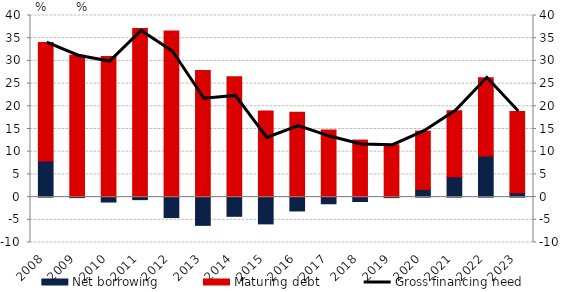
| Category | Net borrowing | Maturing debt |
|---|---|---|
| 2008.0 | 7.937 | 26.102 |
| 2009.0 | -0.115 | 31.264 |
| 2010.0 | -1.088 | 30.946 |
| 2011.0 | -0.558 | 37.14 |
| 2012.0 | -4.505 | 36.569 |
| 2013.0 | -6.224 | 27.885 |
| 2014.0 | -4.231 | 26.516 |
| 2015.0 | -5.901 | 18.943 |
| 2016.0 | -3.053 | 18.692 |
| 2017.0 | -1.469 | 14.806 |
| 2018.0 | -0.969 | 12.568 |
| 2019.0 | -0.113 | 11.555 |
| 2020.0 | 1.705 | 12.818 |
| 2021.0 | 4.485 | 14.514 |
| 2022.0 | 9.05 | 17.223 |
| 2023.0 | 0.978 | 17.862 |